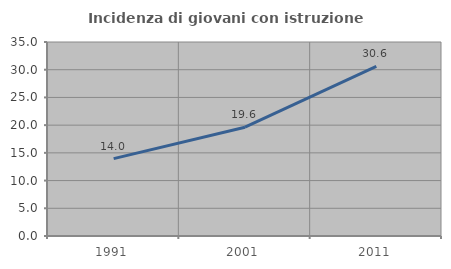
| Category | Incidenza di giovani con istruzione universitaria |
|---|---|
| 1991.0 | 13.958 |
| 2001.0 | 19.624 |
| 2011.0 | 30.614 |